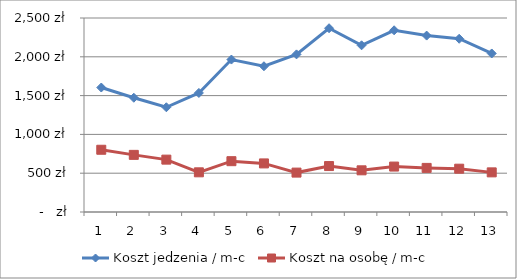
| Category | Koszt jedzenia / m-c | Koszt na osobę / m-c |
|---|---|---|
| 0 | 1604.174 | 802.087 |
| 1 | 1472.495 | 736.248 |
| 2 | 1349.646 | 674.823 |
| 3 | 1534.116 | 511.372 |
| 4 | 1964.462 | 654.821 |
| 5 | 1878.421 | 626.14 |
| 6 | 2031.187 | 507.797 |
| 7 | 2368.123 | 592.031 |
| 8 | 2148.112 | 537.028 |
| 9 | 2341.63 | 585.407 |
| 10 | 2273.355 | 568.339 |
| 11 | 2232.598 | 558.149 |
| 12 | 2042.772 | 510.693 |